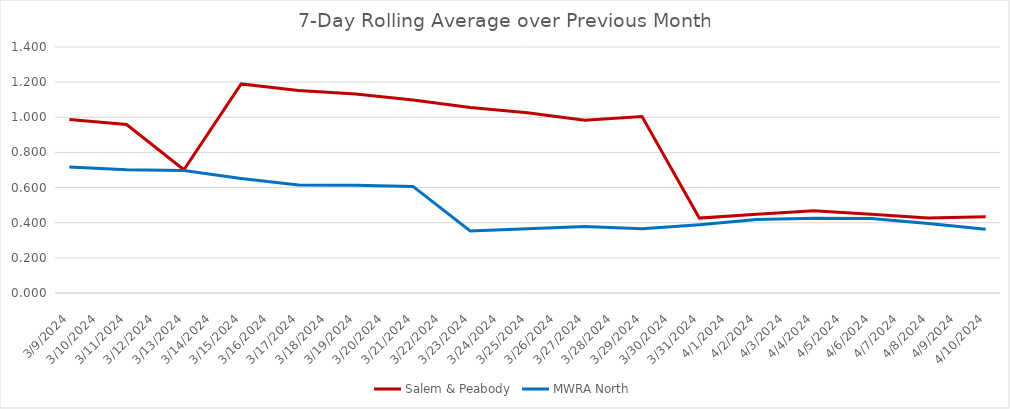
| Category | Salem & Peabody | MWRA North |
|---|---|---|
| 3/9/24 | 0.988 | 0.717 |
| 3/11/24 | 0.959 | 0.702 |
| 3/13/24 | 0.701 | 0.696 |
| 3/15/24 | 1.19 | 0.652 |
| 3/17/24 | 1.152 | 0.614 |
| 3/19/24 | 1.132 | 0.613 |
| 3/21/24 | 1.099 | 0.607 |
| 3/23/24 | 1.056 | 0.353 |
| 3/25/24 | 1.026 | 0.366 |
| 3/27/24 | 0.984 | 0.379 |
| 3/29/24 | 1.004 | 0.366 |
| 3/31/24 | 0.426 | 0.389 |
| 4/2/24 | 0.448 | 0.418 |
| 4/4/24 | 0.468 | 0.425 |
| 4/6/24 | 0.449 | 0.424 |
| 4/8/24 | 0.426 | 0.396 |
| 4/10/24 | 0.434 | 0.363 |